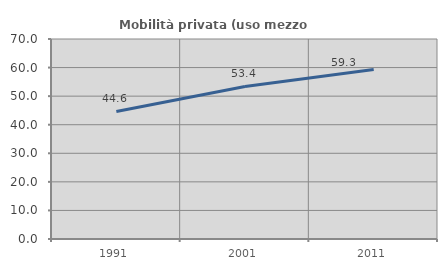
| Category | Mobilità privata (uso mezzo privato) |
|---|---|
| 1991.0 | 44.644 |
| 2001.0 | 53.394 |
| 2011.0 | 59.33 |